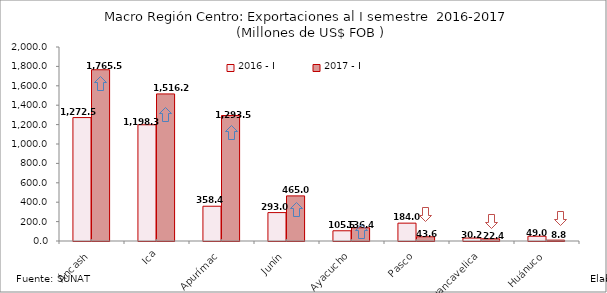
| Category | 2016 - I | 2017 - I |
|---|---|---|
| Áncash | 1272.465 | 1765.547 |
| Ica | 1198.31 | 1516.152 |
| Apurímac | 358.395 | 1293.534 |
| Junín | 292.963 | 465 |
| Ayacucho | 105.465 | 136.392 |
| Pasco | 184.043 | 43.561 |
| Huancavelica | 30.156 | 22.433 |
| Huánuco | 48.974 | 8.828 |